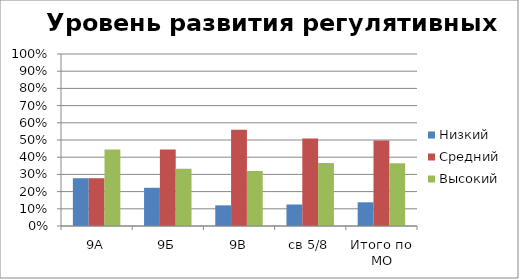
| Category | Низкий | Средний | Высокий |
|---|---|---|---|
| 9А | 0.278 | 0.278 | 0.444 |
| 9Б | 0.222 | 0.444 | 0.333 |
| 9В | 0.12 | 0.56 | 0.32 |
| св 5/8 | 0.125 | 0.509 | 0.366 |
| Итого по МО | 0.138 | 0.498 | 0.365 |